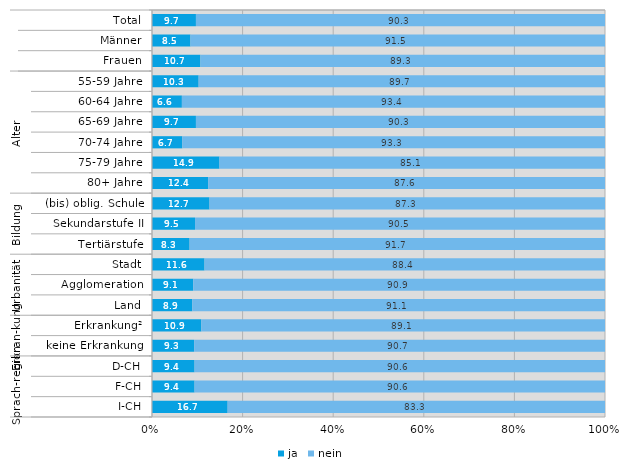
| Category | ja | nein |
|---|---|---|
| 0 | 9.7 | 90.3 |
| 1 | 8.5 | 91.5 |
| 2 | 10.7 | 89.3 |
| 3 | 10.3 | 89.7 |
| 4 | 6.6 | 93.4 |
| 5 | 9.7 | 90.3 |
| 6 | 6.7 | 93.3 |
| 7 | 14.9 | 85.1 |
| 8 | 12.4 | 87.6 |
| 9 | 12.7 | 87.3 |
| 10 | 9.5 | 90.5 |
| 11 | 8.3 | 91.7 |
| 12 | 11.6 | 88.4 |
| 13 | 9.1 | 90.9 |
| 14 | 8.9 | 91.1 |
| 15 | 10.9 | 89.1 |
| 16 | 9.3 | 90.7 |
| 17 | 9.4 | 90.6 |
| 18 | 9.4 | 90.6 |
| 19 | 16.7 | 83.3 |